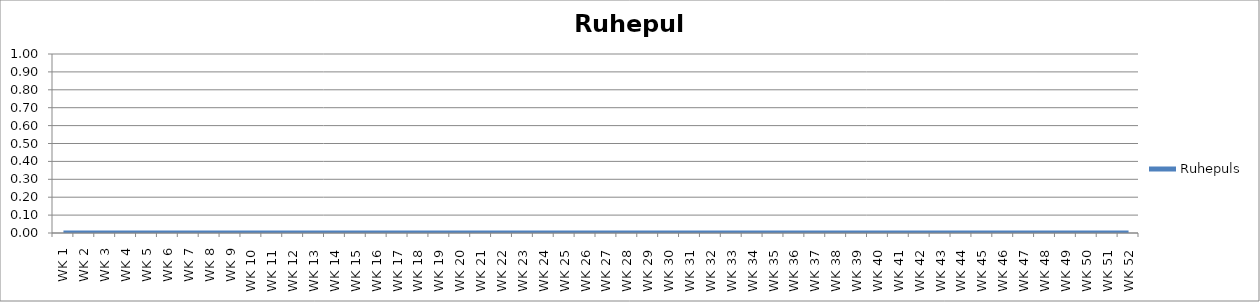
| Category | Ruhepuls |
|---|---|
| WK 1 | 0 |
| WK 2 | 0 |
| WK 3 | 0 |
| WK 4 | 0 |
| WK 5 | 0 |
| WK 6 | 0 |
| WK 7 | 0 |
| WK 8 | 0 |
| WK 9 | 0 |
| WK 10 | 0 |
| WK 11 | 0 |
| WK 12 | 0 |
| WK 13 | 0 |
| WK 14 | 0 |
| WK 15 | 0 |
| WK 16 | 0 |
| WK 17 | 0 |
| WK 18 | 0 |
| WK 19 | 0 |
| WK 20 | 0 |
| WK 21 | 0 |
| WK 22 | 0 |
| WK 23 | 0 |
| WK 24 | 0 |
| WK 25 | 0 |
| WK 26 | 0 |
| WK 27 | 0 |
| WK 28 | 0 |
| WK 29 | 0 |
| WK 30 | 0 |
| WK 31 | 0 |
| WK 32 | 0 |
| WK 33 | 0 |
| WK 34 | 0 |
| WK 35 | 0 |
| WK 36 | 0 |
| WK 37 | 0 |
| WK 38 | 0 |
| WK 39 | 0 |
| WK 40 | 0 |
| WK 41 | 0 |
| WK 42 | 0 |
| WK 43 | 0 |
| WK 44 | 0 |
| WK 45 | 0 |
| WK 46 | 0 |
| WK 47 | 0 |
| WK 48 | 0 |
| WK 49 | 0 |
| WK 50 | 0 |
| WK 51 | 0 |
| WK 52 | 0 |